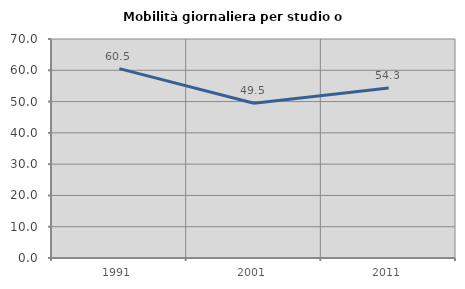
| Category | Mobilità giornaliera per studio o lavoro |
|---|---|
| 1991.0 | 60.545 |
| 2001.0 | 49.451 |
| 2011.0 | 54.332 |